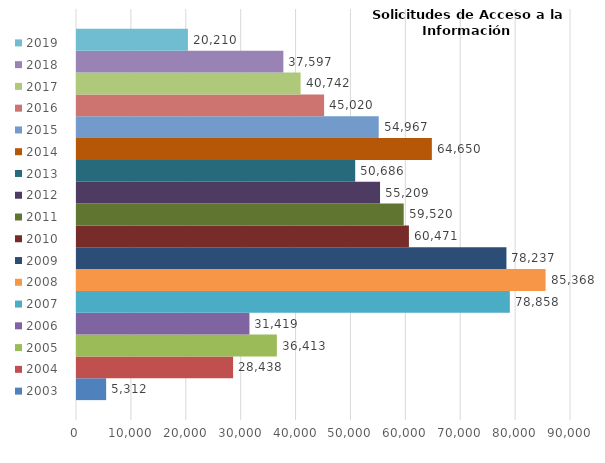
| Category | 2003 | 2004 | 2005 | 2006 | 2007 | 2008 | 2009 | 2010 | 2011 | 2012 | 2013 | 2014 | 2015 | 2016 | 2017 | 2018 | 2019 |
|---|---|---|---|---|---|---|---|---|---|---|---|---|---|---|---|---|---|
| 0 | 5312 | 28438 | 36413 | 31419 | 78858 | 85368 | 78237 | 60471 | 59520 | 55209 | 50686 | 64650 | 54967 | 45020 | 40742 | 37597 | 20210 |